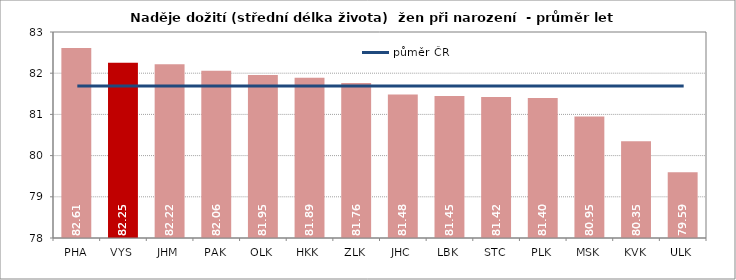
| Category | Series 0 |
|---|---|
| PHA | 82.613 |
| VYS | 82.255 |
| JHM | 82.217 |
| PAK | 82.057 |
| OLK | 81.954 |
| HKK | 81.889 |
| ZLK | 81.762 |
| JHC | 81.485 |
| LBK | 81.448 |
| STC | 81.42 |
| PLK | 81.399 |
| MSK | 80.947 |
| KVK | 80.348 |
| ULK | 79.594 |